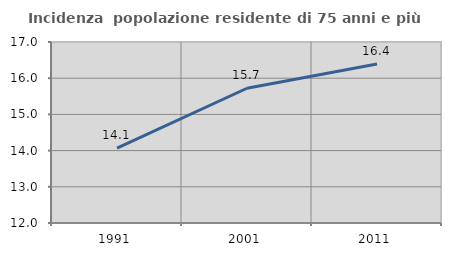
| Category | Incidenza  popolazione residente di 75 anni e più |
|---|---|
| 1991.0 | 14.069 |
| 2001.0 | 15.722 |
| 2011.0 | 16.391 |